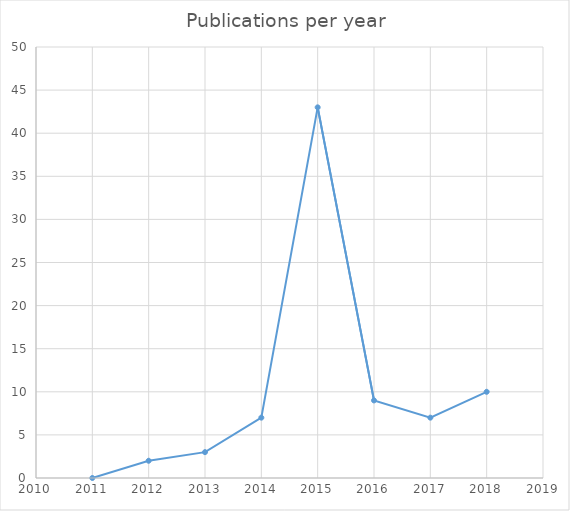
| Category | Series 0 |
|---|---|
| 2011.0 | 0 |
| 2012.0 | 2 |
| 2013.0 | 3 |
| 2014.0 | 7 |
| 2015.0 | 43 |
| 2016.0 | 9 |
| 2017.0 | 7 |
| 2018.0 | 10 |